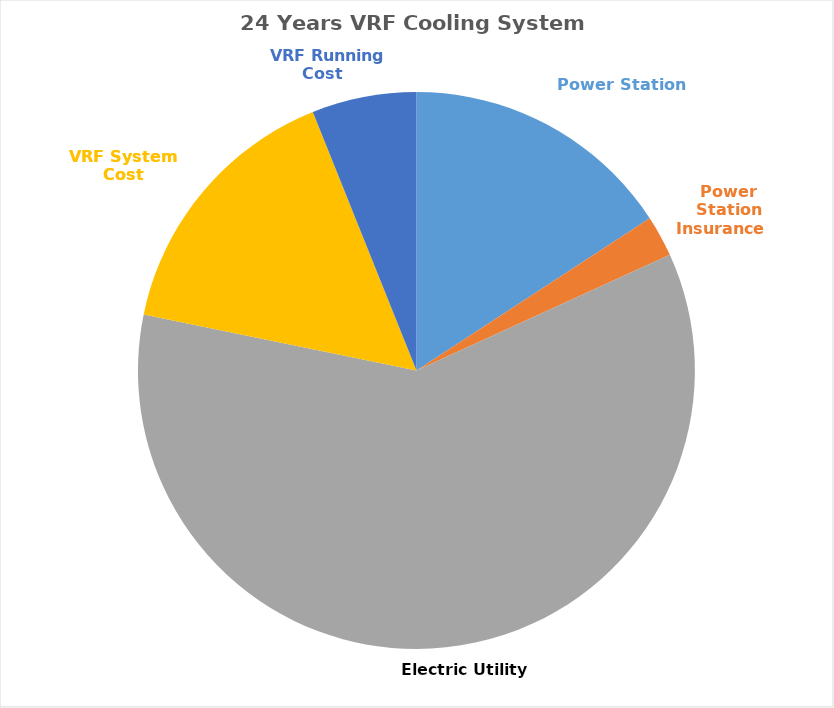
| Category | Series 0 |
|---|---|
| Power Station     | 274102935.197 |
| Power Station Insurance    | 41537233.091 |
| Electric Utility     | 1042063398.846 |
| VRF System Cost | 272649776.896 |
|   VRF Running Cost | 105371356.527 |